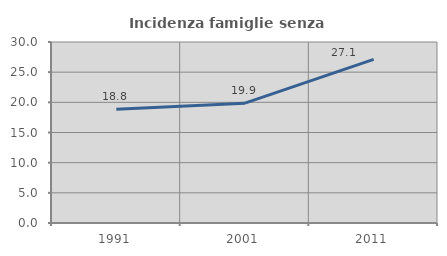
| Category | Incidenza famiglie senza nuclei |
|---|---|
| 1991.0 | 18.841 |
| 2001.0 | 19.859 |
| 2011.0 | 27.124 |